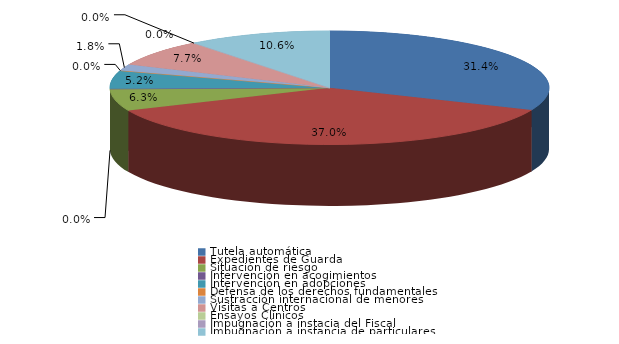
| Category | Series 0 |
|---|---|
| Tutela automática | 175 |
| Expedientes de Guarda | 206 |
| Situación de riesgo | 35 |
| Intervención en acogimientos | 0 |
| Intervención en adopciones | 29 |
| Defensa de los derechos fundamentales | 0 |
| Sustracción internacional de menores | 10 |
| Visitas a Centros | 43 |
| Ensayos Clínicos | 0 |
| Impugnación a instacia del Fiscal | 0 |
| Impugnación a instancia de particulares | 59 |